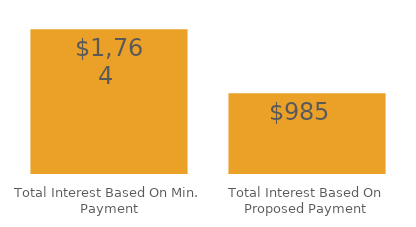
| Category | Series 0 |
|---|---|
| Total Interest Based On Min. Payment | 1763.952 |
| Total Interest Based On Proposed Payment | 984.811 |